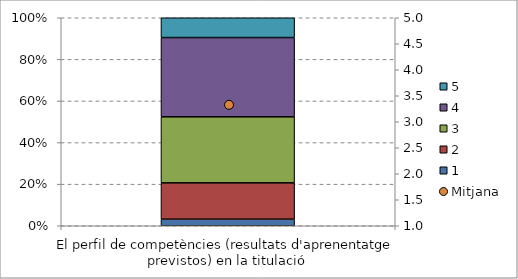
| Category | 1 | 2 | 3 | 4 | 5 |
|---|---|---|---|---|---|
| El perfil de competències (resultats d'aprenentatge previstos) en la titulació | 2 | 11 | 20 | 24 | 6 |